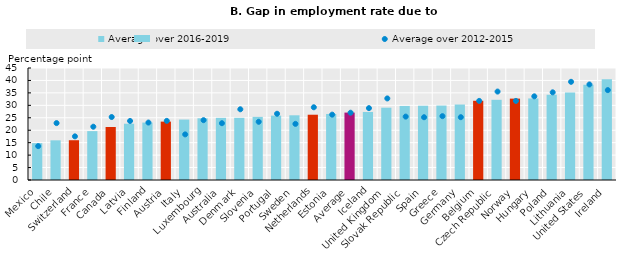
| Category | Average over 2016-2019 |
|---|---|
| Mexico | 14.815 |
| Chile | 15.939 |
| Switzerland | 15.98 |
| France | 19.64 |
| Canada | 21.3 |
| Latvia | 22.612 |
| Finland | 23.083 |
| Austria | 23.461 |
| Italy | 24.279 |
| Luxembourg | 24.802 |
| Australia | 24.967 |
| Denmark | 24.982 |
| Slovenia | 25.368 |
| Portugal | 25.862 |
| Sweden | 26 |
| Netherlands | 26.226 |
| Estonia | 26.533 |
| Average | 27.087 |
| Iceland | 27.342 |
| United Kingdom | 29.057 |
| Slovak Republic | 29.759 |
| Spain | 29.842 |
| Greece | 29.909 |
| Germany | 30.325 |
| Belgium | 31.828 |
| Czech Republic | 32.224 |
| Norway | 32.696 |
| Hungary | 32.77 |
| Poland | 34.268 |
| Lithuania | 35.142 |
| United States | 38.245 |
| Ireland | 40.434 |